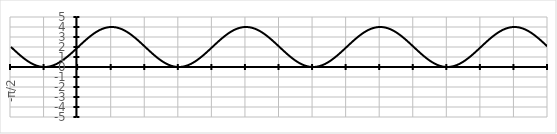
| Category | Series 0 |
|---|---|
| -π/2 | 2 |
|  | 1.93 |
|  | 1.86 |
|  | 1.791 |
|  | 1.722 |
|  | 1.653 |
|  | 1.584 |
|  | 1.516 |
|  | 1.449 |
|  | 1.382 |
|  | 1.316 |
|  | 1.251 |
|  | 1.187 |
|  | 1.123 |
|  | 1.061 |
|  | 1 |
|  | 0.94 |
|  | 0.882 |
|  | 0.824 |
|  | 0.769 |
|  | 0.714 |
|  | 0.662 |
|  | 0.611 |
|  | 0.561 |
|  | 0.514 |
|  | 0.468 |
|  | 0.424 |
|  | 0.382 |
|  | 0.342 |
|  | 0.304 |
|  | 0.268 |
|  | 0.234 |
|  | 0.202 |
|  | 0.173 |
|  | 0.146 |
|  | 0.121 |
|  | 0.098 |
|  | 0.077 |
|  | 0.059 |
|  | 0.044 |
|  | 0.03 |
|  | 0.019 |
|  | 0.011 |
|  | 0.005 |
|  | 0.001 |
|   | 0 |
|  | 0.001 |
|  | 0.005 |
|  | 0.011 |
|  | 0.019 |
|  | 0.03 |
|  | 0.044 |
|  | 0.059 |
|  | 0.077 |
|  | 0.098 |
|  | 0.121 |
|  | 0.146 |
|  | 0.173 |
|  | 0.202 |
|  | 0.234 |
|  | 0.268 |
|  | 0.304 |
|  | 0.342 |
|  | 0.382 |
|  | 0.424 |
|  | 0.468 |
|  | 0.514 |
|  | 0.561 |
|  | 0.611 |
|  | 0.662 |
|  | 0.714 |
|  | 0.769 |
|  | 0.824 |
|  | 0.882 |
|  | 0.94 |
|  | 1 |
|  | 1.061 |
|  | 1.123 |
|  | 1.187 |
|  | 1.251 |
|  | 1.316 |
|  | 1.382 |
|  | 1.449 |
|  | 1.516 |
|  | 1.584 |
|  | 1.653 |
|  | 1.722 |
|  | 1.791 |
|  | 1.86 |
|  | 1.93 |
| 0 | 2 |
|  | 2.07 |
|  | 2.14 |
|  | 2.209 |
|  | 2.278 |
|  | 2.347 |
|  | 2.416 |
|  | 2.484 |
|  | 2.551 |
|  | 2.618 |
|  | 2.684 |
|  | 2.749 |
|  | 2.813 |
|  | 2.877 |
|  | 2.939 |
|  | 3 |
|  | 3.06 |
|  | 3.118 |
|  | 3.176 |
|  | 3.231 |
|  | 3.286 |
|  | 3.338 |
|  | 3.389 |
|  | 3.439 |
|  | 3.486 |
|  | 3.532 |
|  | 3.576 |
|  | 3.618 |
|  | 3.658 |
|  | 3.696 |
|  | 3.732 |
|  | 3.766 |
|  | 3.798 |
|  | 3.827 |
|  | 3.854 |
|  | 3.879 |
|  | 3.902 |
|  | 3.923 |
|  | 3.941 |
|  | 3.956 |
|  | 3.97 |
|  | 3.981 |
|  | 3.989 |
|  | 3.995 |
|  | 3.999 |
|   | 4 |
|  | 3.999 |
|  | 3.995 |
|  | 3.989 |
|  | 3.981 |
|  | 3.97 |
|  | 3.956 |
|  | 3.941 |
|  | 3.923 |
|  | 3.902 |
|  | 3.879 |
|  | 3.854 |
|  | 3.827 |
|  | 3.798 |
|  | 3.766 |
|  | 3.732 |
|  | 3.696 |
|  | 3.658 |
|  | 3.618 |
|  | 3.576 |
|  | 3.532 |
|  | 3.486 |
|  | 3.439 |
|  | 3.389 |
|  | 3.338 |
|  | 3.286 |
|  | 3.231 |
|  | 3.176 |
|  | 3.118 |
|  | 3.06 |
|  | 3 |
|  | 2.939 |
|  | 2.877 |
|  | 2.813 |
|  | 2.749 |
|  | 2.684 |
|  | 2.618 |
|  | 2.551 |
|  | 2.484 |
|  | 2.416 |
|  | 2.347 |
|  | 2.278 |
|  | 2.209 |
|  | 2.14 |
|  | 2.07 |
| π/2 | 2 |
|  | 1.93 |
|  | 1.86 |
|  | 1.791 |
|  | 1.722 |
|  | 1.653 |
|  | 1.584 |
|  | 1.516 |
|  | 1.449 |
|  | 1.382 |
|  | 1.316 |
|  | 1.251 |
|  | 1.187 |
|  | 1.123 |
|  | 1.061 |
|  | 1 |
|  | 0.94 |
|  | 0.882 |
|  | 0.824 |
|  | 0.769 |
|  | 0.714 |
|  | 0.662 |
|  | 0.611 |
|  | 0.561 |
|  | 0.514 |
|  | 0.468 |
|  | 0.424 |
|  | 0.382 |
|  | 0.342 |
|  | 0.304 |
|  | 0.268 |
|  | 0.234 |
|  | 0.202 |
|  | 0.173 |
|  | 0.146 |
|  | 0.121 |
|  | 0.098 |
|  | 0.077 |
|  | 0.059 |
|  | 0.044 |
|  | 0.03 |
|  | 0.019 |
|  | 0.011 |
|  | 0.005 |
|  | 0.001 |
|   | 0 |
|  | 0.001 |
|  | 0.005 |
|  | 0.011 |
|  | 0.019 |
|  | 0.03 |
|  | 0.044 |
|  | 0.059 |
|  | 0.077 |
|  | 0.098 |
|  | 0.121 |
|  | 0.146 |
|  | 0.173 |
|  | 0.202 |
|  | 0.234 |
|  | 0.268 |
|  | 0.304 |
|  | 0.342 |
|  | 0.382 |
|  | 0.424 |
|  | 0.468 |
|  | 0.514 |
|  | 0.561 |
|  | 0.611 |
|  | 0.662 |
|  | 0.714 |
|  | 0.769 |
|  | 0.824 |
|  | 0.882 |
|  | 0.94 |
|  | 1 |
|  | 1.061 |
|  | 1.123 |
|  | 1.187 |
|  | 1.251 |
|  | 1.316 |
|  | 1.382 |
|  | 1.449 |
|  | 1.516 |
|  | 1.584 |
|  | 1.653 |
|  | 1.722 |
|  | 1.791 |
|  | 1.86 |
|  | 1.93 |
| π | 2 |
|  | 2.07 |
|  | 2.14 |
|  | 2.209 |
|  | 2.278 |
|  | 2.347 |
|  | 2.416 |
|  | 2.484 |
|  | 2.551 |
|  | 2.618 |
|  | 2.684 |
|  | 2.749 |
|  | 2.813 |
|  | 2.877 |
|  | 2.939 |
|  | 3 |
|  | 3.06 |
|  | 3.118 |
|  | 3.176 |
|  | 3.231 |
|  | 3.286 |
|  | 3.338 |
|  | 3.389 |
|  | 3.439 |
|  | 3.486 |
|  | 3.532 |
|  | 3.576 |
|  | 3.618 |
|  | 3.658 |
|  | 3.696 |
|  | 3.732 |
|  | 3.766 |
|  | 3.798 |
|  | 3.827 |
|  | 3.854 |
|  | 3.879 |
|  | 3.902 |
|  | 3.923 |
|  | 3.941 |
|  | 3.956 |
|  | 3.97 |
|  | 3.981 |
|  | 3.989 |
|  | 3.995 |
|  | 3.999 |
|   | 4 |
|  | 3.999 |
|  | 3.995 |
|  | 3.989 |
|  | 3.981 |
|  | 3.97 |
|  | 3.956 |
|  | 3.941 |
|  | 3.923 |
|  | 3.902 |
|  | 3.879 |
|  | 3.854 |
|  | 3.827 |
|  | 3.798 |
|  | 3.766 |
|  | 3.732 |
|  | 3.696 |
|  | 3.658 |
|  | 3.618 |
|  | 3.576 |
|  | 3.532 |
|  | 3.486 |
|  | 3.439 |
|  | 3.389 |
|  | 3.338 |
|  | 3.286 |
|  | 3.231 |
|  | 3.176 |
|  | 3.118 |
|  | 3.06 |
|  | 3 |
|  | 2.939 |
|  | 2.877 |
|  | 2.813 |
|  | 2.749 |
|  | 2.684 |
|  | 2.618 |
|  | 2.551 |
|  | 2.484 |
|  | 2.416 |
|  | 2.347 |
|  | 2.278 |
|  | 2.209 |
|  | 2.14 |
|  | 2.07 |
| 3π/2 | 2 |
|  | 1.93 |
|  | 1.86 |
|  | 1.791 |
|  | 1.722 |
|  | 1.653 |
|  | 1.584 |
|  | 1.516 |
|  | 1.449 |
|  | 1.382 |
|  | 1.316 |
|  | 1.251 |
|  | 1.187 |
|  | 1.123 |
|  | 1.061 |
|  | 1 |
|  | 0.94 |
|  | 0.882 |
|  | 0.824 |
|  | 0.769 |
|  | 0.714 |
|  | 0.662 |
|  | 0.611 |
|  | 0.561 |
|  | 0.514 |
|  | 0.468 |
|  | 0.424 |
|  | 0.382 |
|  | 0.342 |
|  | 0.304 |
|  | 0.268 |
|  | 0.234 |
|  | 0.202 |
|  | 0.173 |
|  | 0.146 |
|  | 0.121 |
|  | 0.098 |
|  | 0.077 |
|  | 0.059 |
|  | 0.044 |
|  | 0.03 |
|  | 0.019 |
|  | 0.011 |
|  | 0.005 |
|  | 0.001 |
|   | 0 |
|  | 0.001 |
|  | 0.005 |
|  | 0.011 |
|  | 0.019 |
|  | 0.03 |
|  | 0.044 |
|  | 0.059 |
|  | 0.077 |
|  | 0.098 |
|  | 0.121 |
|  | 0.146 |
|  | 0.173 |
|  | 0.202 |
|  | 0.234 |
|  | 0.268 |
|  | 0.304 |
|  | 0.342 |
|  | 0.382 |
|  | 0.424 |
|  | 0.468 |
|  | 0.514 |
|  | 0.561 |
|  | 0.611 |
|  | 0.662 |
|  | 0.714 |
|  | 0.769 |
|  | 0.824 |
|  | 0.882 |
|  | 0.94 |
|  | 1 |
|  | 1.061 |
|  | 1.123 |
|  | 1.187 |
|  | 1.251 |
|  | 1.316 |
|  | 1.382 |
|  | 1.449 |
|  | 1.516 |
|  | 1.584 |
|  | 1.653 |
|  | 1.722 |
|  | 1.791 |
|  | 1.86 |
|  | 1.93 |
| 2π | 2 |
|  | 2.07 |
|  | 2.14 |
|  | 2.209 |
|  | 2.278 |
|  | 2.347 |
|  | 2.416 |
|  | 2.484 |
|  | 2.551 |
|  | 2.618 |
|  | 2.684 |
|  | 2.749 |
|  | 2.813 |
|  | 2.877 |
|  | 2.939 |
|  | 3 |
|  | 3.06 |
|  | 3.118 |
|  | 3.176 |
|  | 3.231 |
|  | 3.286 |
|  | 3.338 |
|  | 3.389 |
|  | 3.439 |
|  | 3.486 |
|  | 3.532 |
|  | 3.576 |
|  | 3.618 |
|  | 3.658 |
|  | 3.696 |
|  | 3.732 |
|  | 3.766 |
|  | 3.798 |
|  | 3.827 |
|  | 3.854 |
|  | 3.879 |
|  | 3.902 |
|  | 3.923 |
|  | 3.941 |
|  | 3.956 |
|  | 3.97 |
|  | 3.981 |
|  | 3.989 |
|  | 3.995 |
|  | 3.999 |
|   | 4 |
|  | 3.999 |
|  | 3.995 |
|  | 3.989 |
|  | 3.981 |
|  | 3.97 |
|  | 3.956 |
|  | 3.941 |
|  | 3.923 |
|  | 3.902 |
|  | 3.879 |
|  | 3.854 |
|  | 3.827 |
|  | 3.798 |
|  | 3.766 |
|  | 3.732 |
|  | 3.696 |
|  | 3.658 |
|  | 3.618 |
|  | 3.576 |
|  | 3.532 |
|  | 3.486 |
|  | 3.439 |
|  | 3.389 |
|  | 3.338 |
|  | 3.286 |
|  | 3.231 |
|  | 3.176 |
|  | 3.118 |
|  | 3.06 |
|  | 3 |
|  | 2.939 |
|  | 2.877 |
|  | 2.813 |
|  | 2.749 |
|  | 2.684 |
|  | 2.618 |
|  | 2.551 |
|  | 2.484 |
|  | 2.416 |
|  | 2.347 |
|  | 2.278 |
|  | 2.209 |
|  | 2.14 |
|  | 2.07 |
| 5π/2 | 2 |
|  | 1.93 |
|  | 1.86 |
|  | 1.791 |
|  | 1.722 |
|  | 1.653 |
|  | 1.584 |
|  | 1.516 |
|  | 1.449 |
|  | 1.382 |
|  | 1.316 |
|  | 1.251 |
|  | 1.187 |
|  | 1.123 |
|  | 1.061 |
|  | 1 |
|  | 0.94 |
|  | 0.882 |
|  | 0.824 |
|  | 0.769 |
|  | 0.714 |
|  | 0.662 |
|  | 0.611 |
|  | 0.561 |
|  | 0.514 |
|  | 0.468 |
|  | 0.424 |
|  | 0.382 |
|  | 0.342 |
|  | 0.304 |
|  | 0.268 |
|  | 0.234 |
|  | 0.202 |
|  | 0.173 |
|  | 0.146 |
|  | 0.121 |
|  | 0.098 |
|  | 0.077 |
|  | 0.059 |
|  | 0.044 |
|  | 0.03 |
|  | 0.019 |
|  | 0.011 |
|  | 0.005 |
|  | 0.001 |
|   | 0 |
|  | 0.001 |
|  | 0.005 |
|  | 0.011 |
|  | 0.019 |
|  | 0.03 |
|  | 0.044 |
|  | 0.059 |
|  | 0.077 |
|  | 0.098 |
|  | 0.121 |
|  | 0.146 |
|  | 0.173 |
|  | 0.202 |
|  | 0.234 |
|  | 0.268 |
|  | 0.304 |
|  | 0.342 |
|  | 0.382 |
|  | 0.424 |
|  | 0.468 |
|  | 0.514 |
|  | 0.561 |
|  | 0.611 |
|  | 0.662 |
|  | 0.714 |
|  | 0.769 |
|  | 0.824 |
|  | 0.882 |
|  | 0.94 |
|  | 1 |
|  | 1.061 |
|  | 1.123 |
|  | 1.187 |
|  | 1.251 |
|  | 1.316 |
|  | 1.382 |
|  | 1.449 |
|  | 1.516 |
|  | 1.584 |
|  | 1.653 |
|  | 1.722 |
|  | 1.791 |
|  | 1.86 |
|  | 1.93 |
| 3π | 2 |
|  | 2.07 |
|  | 2.14 |
|  | 2.209 |
|  | 2.278 |
|  | 2.347 |
|  | 2.416 |
|  | 2.484 |
|  | 2.551 |
|  | 2.618 |
|  | 2.684 |
|  | 2.749 |
|  | 2.813 |
|  | 2.877 |
|  | 2.939 |
|  | 3 |
|  | 3.06 |
|  | 3.118 |
|  | 3.176 |
|  | 3.231 |
|  | 3.286 |
|  | 3.338 |
|  | 3.389 |
|  | 3.439 |
|  | 3.486 |
|  | 3.532 |
|  | 3.576 |
|  | 3.618 |
|  | 3.658 |
|  | 3.696 |
|  | 3.732 |
|  | 3.766 |
|  | 3.798 |
|  | 3.827 |
|  | 3.854 |
|  | 3.879 |
|  | 3.902 |
|  | 3.923 |
|  | 3.941 |
|  | 3.956 |
|  | 3.97 |
|  | 3.981 |
|  | 3.989 |
|  | 3.995 |
|  | 3.999 |
|   | 4 |
|  | 3.999 |
|  | 3.995 |
|  | 3.989 |
|  | 3.981 |
|  | 3.97 |
|  | 3.956 |
|  | 3.941 |
|  | 3.923 |
|  | 3.902 |
|  | 3.879 |
|  | 3.854 |
|  | 3.827 |
|  | 3.798 |
|  | 3.766 |
|  | 3.732 |
|  | 3.696 |
|  | 3.658 |
|  | 3.618 |
|  | 3.576 |
|  | 3.532 |
|  | 3.486 |
|  | 3.439 |
|  | 3.389 |
|  | 3.338 |
|  | 3.286 |
|  | 3.231 |
|  | 3.176 |
|  | 3.118 |
|  | 3.06 |
|  | 3 |
|  | 2.939 |
|  | 2.877 |
|  | 2.813 |
|  | 2.749 |
|  | 2.684 |
|  | 2.618 |
|  | 2.551 |
|  | 2.484 |
|  | 2.416 |
|  | 2.347 |
|  | 2.278 |
|  | 2.209 |
|  | 2.14 |
|  | 2.07 |
| 7π/2 | 2 |